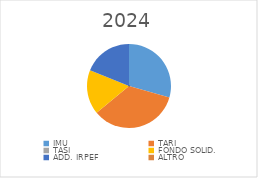
| Category | Series 0 |
|---|---|
| IMU | 2070000 |
| TARI | 2430612 |
| TASI | 0 |
| FONDO SOLID. | 1200000 |
| ADD. IRPEF | 1330000 |
| ALTRO | 0 |